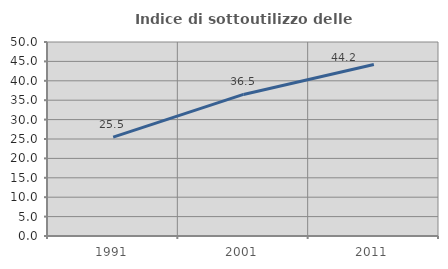
| Category | Indice di sottoutilizzo delle abitazioni  |
|---|---|
| 1991.0 | 25.5 |
| 2001.0 | 36.484 |
| 2011.0 | 44.2 |